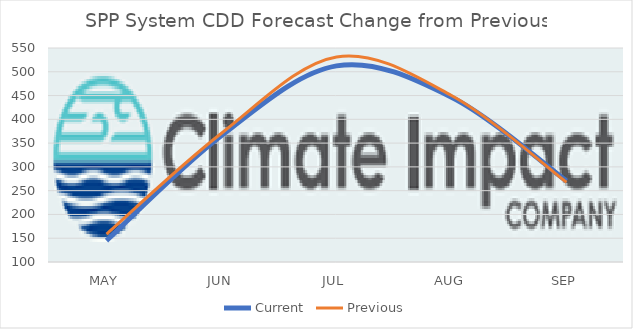
| Category | Current | Previous |
|---|---|---|
| MAY | 145 | 158.8 |
| JUN | 365.8 | 370.8 |
| JUL | 512.4 | 531.2 |
| AUG | 446.4 | 450 |
| SEP | 270.4 | 267.8 |